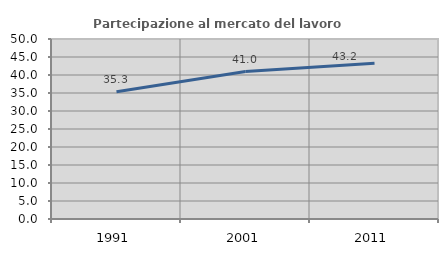
| Category | Partecipazione al mercato del lavoro  femminile |
|---|---|
| 1991.0 | 35.332 |
| 2001.0 | 40.954 |
| 2011.0 | 43.239 |